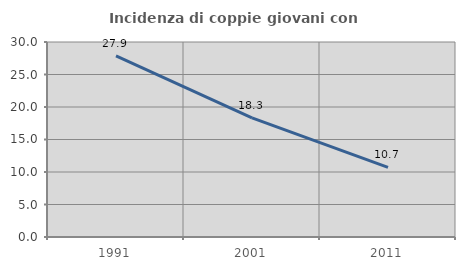
| Category | Incidenza di coppie giovani con figli |
|---|---|
| 1991.0 | 27.85 |
| 2001.0 | 18.328 |
| 2011.0 | 10.717 |